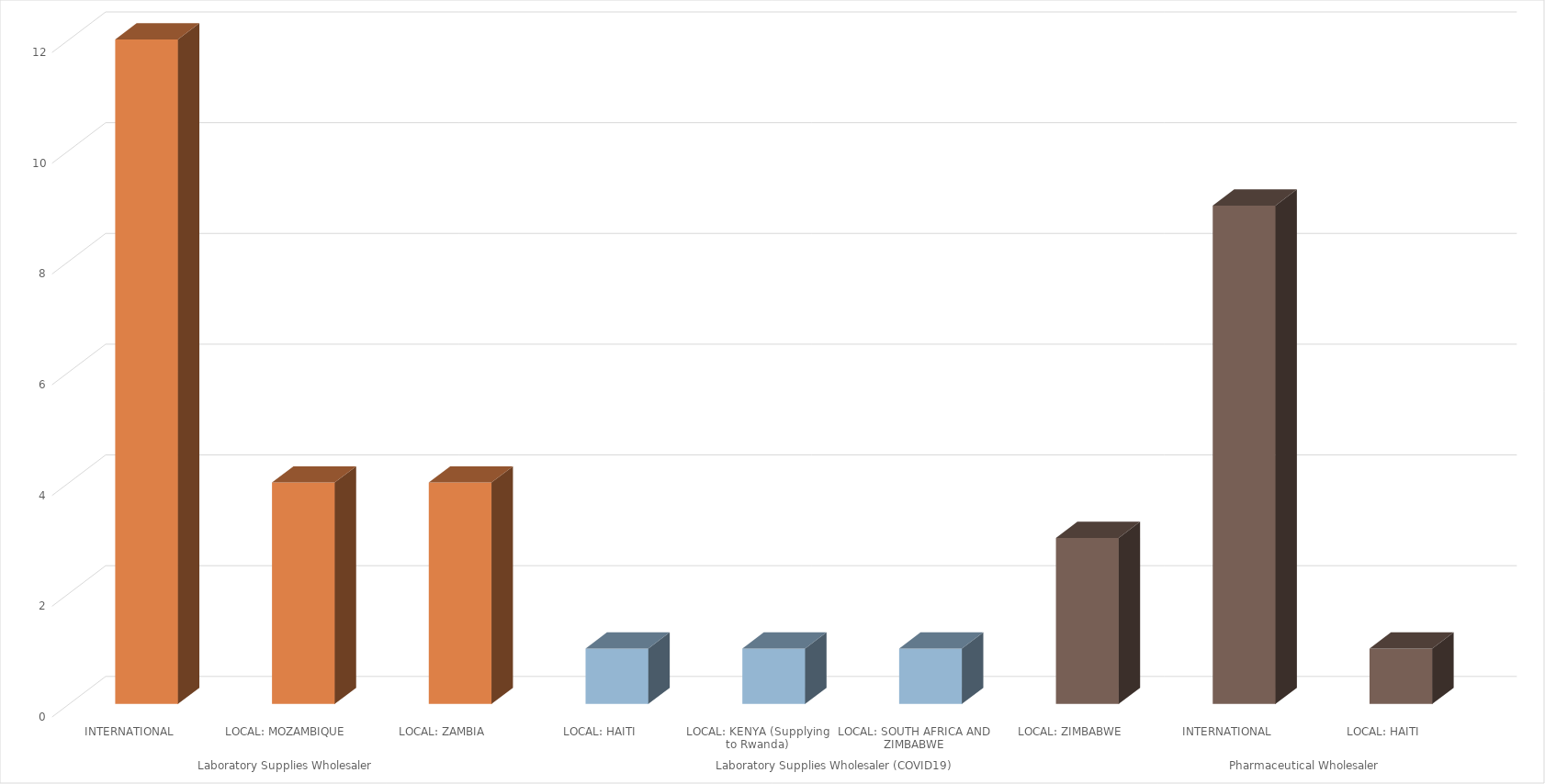
| Category | Total |
|---|---|
| 0 | 12 |
| 1 | 4 |
| 2 | 4 |
| 3 | 1 |
| 4 | 1 |
| 5 | 1 |
| 6 | 3 |
| 7 | 9 |
| 8 | 1 |